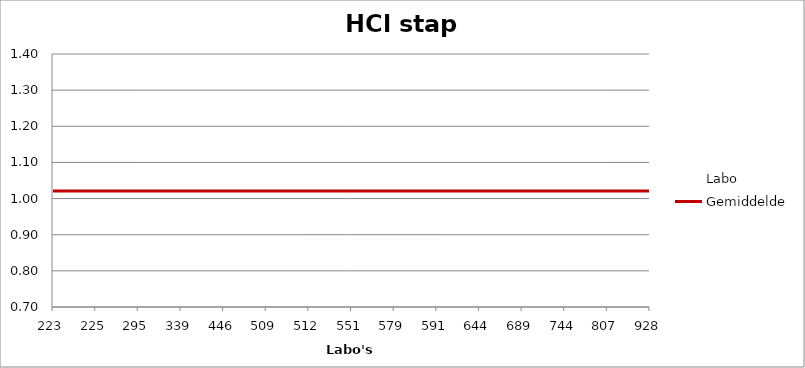
| Category | Labo | Gemiddelde |
|---|---|---|
| 223.0 | 1.03 | 1.021 |
| 225.0 | 1.05 | 1.021 |
| 295.0 | 1.02 | 1.021 |
| 339.0 | 1 | 1.021 |
| 446.0 | 1.06 | 1.021 |
| 509.0 | 1.01 | 1.021 |
| 512.0 | 0.927 | 1.021 |
| 551.0 | 1.15 | 1.021 |
| 579.0 | 0.973 | 1.021 |
| 591.0 | 1.07 | 1.021 |
| 644.0 | 1.331 | 1.021 |
| 689.0 | 0.983 | 1.021 |
| 744.0 | 0.889 | 1.021 |
| 807.0 | 0.995 | 1.021 |
| 928.0 | 3.412 | 1.021 |